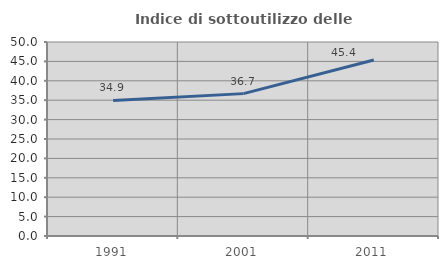
| Category | Indice di sottoutilizzo delle abitazioni  |
|---|---|
| 1991.0 | 34.925 |
| 2001.0 | 36.695 |
| 2011.0 | 45.38 |